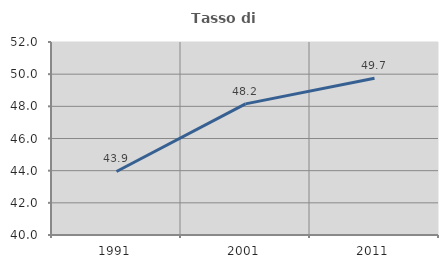
| Category | Tasso di occupazione   |
|---|---|
| 1991.0 | 43.949 |
| 2001.0 | 48.154 |
| 2011.0 | 49.749 |